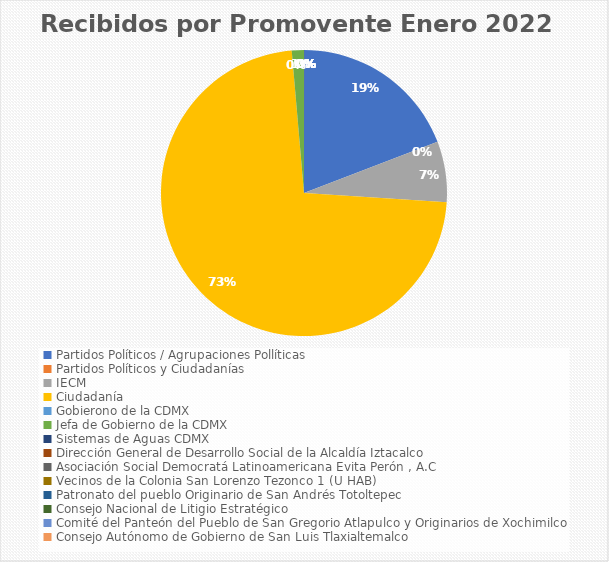
| Category | Recibidos por Promovente Enero |
|---|---|
| Partidos Políticos / Agrupaciones Pollíticas | 14 |
| Partidos Políticos y Ciudadanías | 0 |
| IECM | 5 |
| Ciudadanía  | 53 |
| Gobierono de la CDMX | 0 |
| Jefa de Gobierno de la CDMX | 1 |
| Sistemas de Aguas CDMX | 0 |
| Dirección General de Desarrollo Social de la Alcaldía Iztacalco | 0 |
| Asociación Social Democratá Latinoamericana Evita Perón , A.C | 0 |
| Vecinos de la Colonia San Lorenzo Tezonco 1 (U HAB) | 0 |
| Patronato del pueblo Originario de San Andrés Totoltepec | 0 |
| Consejo Nacional de Litigio Estratégico | 0 |
| Comité del Panteón del Pueblo de San Gregorio Atlapulco y Originarios de Xochimilco | 0 |
| Consejo Autónomo de Gobierno de San Luis Tlaxialtemalco | 0 |